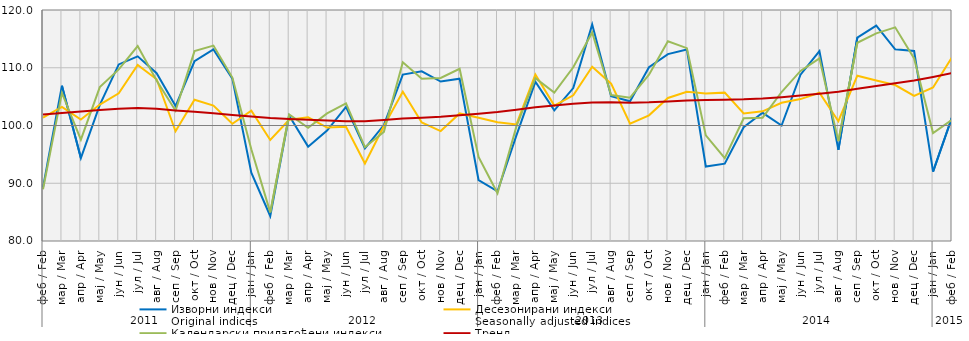
| Category | Изворни индекси
Original indices | Десезонирани индекси
Seasonally adjusted indices | Календарски прилагођени индекси
Working-day adjusted indices | Тренд
Trend |
|---|---|---|---|---|
| 0 | 89.293 | 101.372 | 88.953 | 101.926 |
| 1 | 106.89 | 103.227 | 105.642 | 102.169 |
| 2 | 94.359 | 101.024 | 97.552 | 102.413 |
| 3 | 103.572 | 103.628 | 106.658 | 102.668 |
| 4 | 110.572 | 105.573 | 109.709 | 102.906 |
| 5 | 111.982 | 110.495 | 113.75 | 103.024 |
| 6 | 109.048 | 108.009 | 107.774 | 102.887 |
| 7 | 103.369 | 98.999 | 102.563 | 102.6 |
| 8 | 111.125 | 104.453 | 112.879 | 102.381 |
| 9 | 113.167 | 103.449 | 113.833 | 102.125 |
| 10 | 108.083 | 100.293 | 108.295 | 101.825 |
| 11 | 91.849 | 102.571 | 95.89 | 101.55 |
| 12 | 84.325 | 97.491 | 84.963 | 101.29 |
| 13 | 101.706 | 100.991 | 101.905 | 101.126 |
| 14 | 96.339 | 101.409 | 99.599 | 100.996 |
| 15 | 99.133 | 99.636 | 102.087 | 100.861 |
| 16 | 103.214 | 99.767 | 103.822 | 100.755 |
| 17 | 96.046 | 93.409 | 96.234 | 100.737 |
| 18 | 100.071 | 99.9 | 98.903 | 100.949 |
| 19 | 108.809 | 105.831 | 110.96 | 101.219 |
| 20 | 109.371 | 100.526 | 108.094 | 101.363 |
| 21 | 107.609 | 99.038 | 108.242 | 101.53 |
| 22 | 108.112 | 102.085 | 109.819 | 101.783 |
| 23 | 90.559 | 101.335 | 94.544 | 102.054 |
| 24 | 88.596 | 100.582 | 88.259 | 102.344 |
| 25 | 98.288 | 100.185 | 99.839 | 102.732 |
| 26 | 107.567 | 108.842 | 108.2 | 103.165 |
| 27 | 102.635 | 103.445 | 105.693 | 103.477 |
| 28 | 106.478 | 105.226 | 110.081 | 103.752 |
| 29 | 117.488 | 110.173 | 116.116 | 103.985 |
| 30 | 105.073 | 107.25 | 105.279 | 104.018 |
| 31 | 104.198 | 100.315 | 104.812 | 103.959 |
| 32 | 110.096 | 101.761 | 108.811 | 104.014 |
| 33 | 112.368 | 104.768 | 114.59 | 104.168 |
| 34 | 113.169 | 105.829 | 113.391 | 104.31 |
| 35 | 92.9 | 105.546 | 98.286 | 104.414 |
| 36 | 93.4 | 105.689 | 94.337 | 104.478 |
| 37 | 99.7 | 102.095 | 101.256 | 104.529 |
| 38 | 102.2 | 102.453 | 101.359 | 104.666 |
| 39 | 100 | 103.939 | 105.796 | 104.897 |
| 40 | 108.8 | 104.571 | 109.446 | 105.188 |
| 41 | 112.9 | 105.679 | 111.626 | 105.494 |
| 42 | 95.8 | 100.747 | 97.292 | 105.859 |
| 43 | 115.2 | 108.628 | 114.322 | 106.359 |
| 44 | 117.3 | 107.798 | 115.96 | 106.853 |
| 45 | 113.2 | 107.006 | 116.998 | 107.302 |
| 46 | 112.9 | 105.125 | 111.623 | 107.795 |
| 47 | 92 | 106.59 | 98.686 | 108.395 |
| 48 | 101.4 | 111.805 | 100.975 | 109.065 |